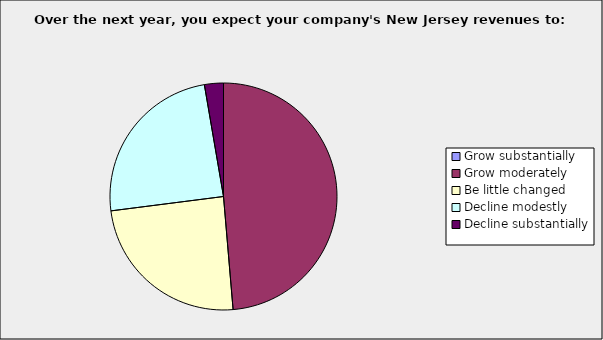
| Category | Series 0 |
|---|---|
| Grow substantially | 0 |
| Grow moderately | 0.486 |
| Be little changed | 0.243 |
| Decline modestly | 0.243 |
| Decline substantially | 0.027 |